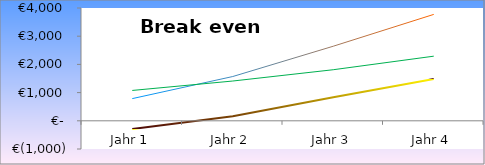
| Category | Kosten Leuchtstoffröhren | Kosten LED | Einsparung |
|---|---|---|---|
| 1.0 | 786.517 | 1076.541 | -290.024 |
| 2.0 | 1570.338 | 1410.391 | 159.947 |
| 3.0 | 2644.256 | 1811.01 | 833.246 |
| 4.0 | 3772.958 | 2291.754 | 1481.205 |